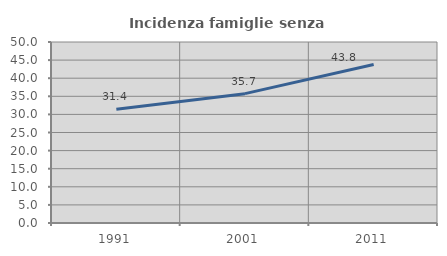
| Category | Incidenza famiglie senza nuclei |
|---|---|
| 1991.0 | 31.393 |
| 2001.0 | 35.735 |
| 2011.0 | 43.761 |